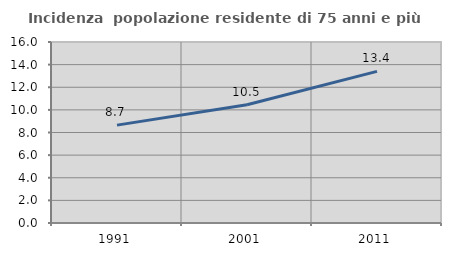
| Category | Incidenza  popolazione residente di 75 anni e più |
|---|---|
| 1991.0 | 8.653 |
| 2001.0 | 10.452 |
| 2011.0 | 13.402 |